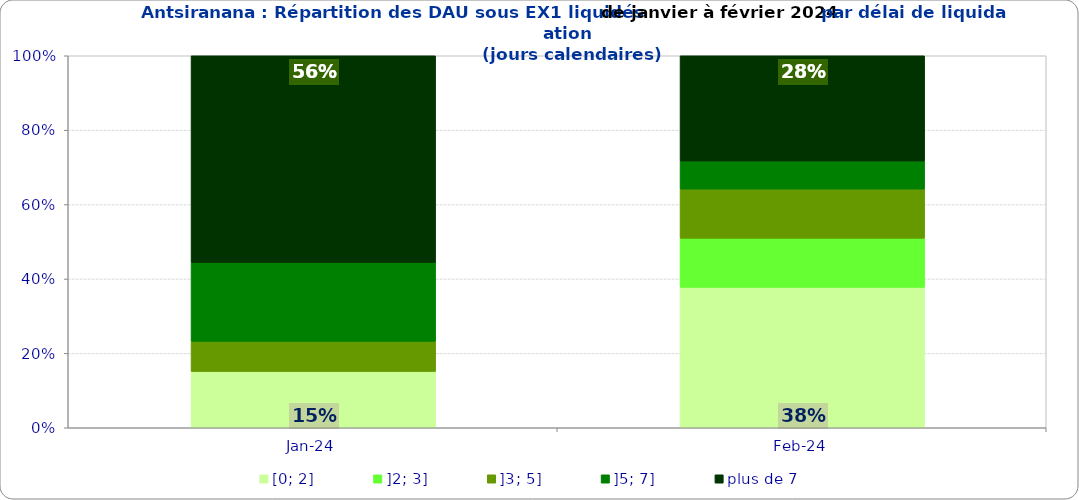
| Category | [0; 2] | ]2; 3] | ]3; 5] | ]5; 7] | plus de 7 |
|---|---|---|---|---|---|
| 2024-01-01 | 0.152 | 0 | 0.081 | 0.212 | 0.556 |
| 2024-02-01 | 0.377 | 0.132 | 0.132 | 0.075 | 0.283 |